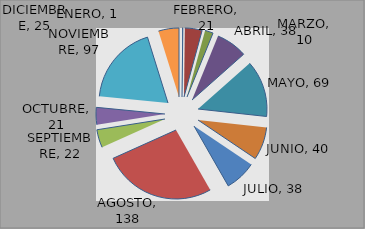
| Category | Series 0 |
|---|---|
|  ENERO | 1 |
| FEBRERO | 21 |
| MARZO | 10 |
| ABRIL | 38 |
| MAYO | 69 |
| JUNIO | 40 |
| JULIO | 38 |
| AGOSTO | 138 |
| SEPTIEMBRE | 22 |
| OCTUBRE | 21 |
| NOVIEMBRE | 97 |
| DICIEMBRE | 25 |